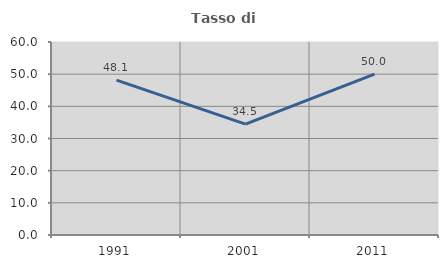
| Category | Tasso di occupazione   |
|---|---|
| 1991.0 | 48.148 |
| 2001.0 | 34.483 |
| 2011.0 | 50 |